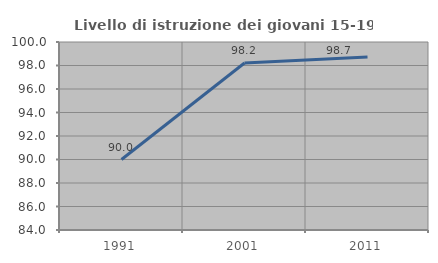
| Category | Livello di istruzione dei giovani 15-19 anni |
|---|---|
| 1991.0 | 90 |
| 2001.0 | 98.214 |
| 2011.0 | 98.718 |